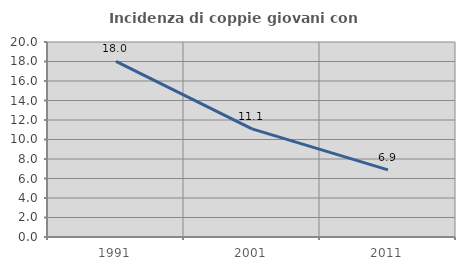
| Category | Incidenza di coppie giovani con figli |
|---|---|
| 1991.0 | 18.019 |
| 2001.0 | 11.094 |
| 2011.0 | 6.885 |